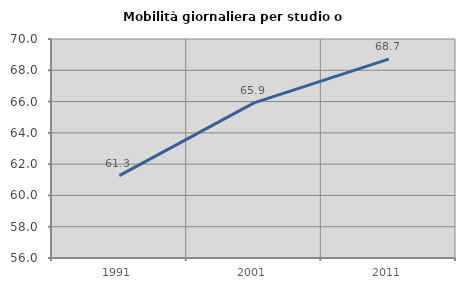
| Category | Mobilità giornaliera per studio o lavoro |
|---|---|
| 1991.0 | 61.264 |
| 2001.0 | 65.915 |
| 2011.0 | 68.718 |